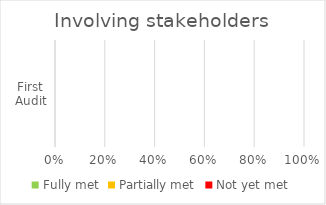
| Category | Fully met | Partially met | Not yet met |
|---|---|---|---|
| First Audit | 0 | 0 | 0 |